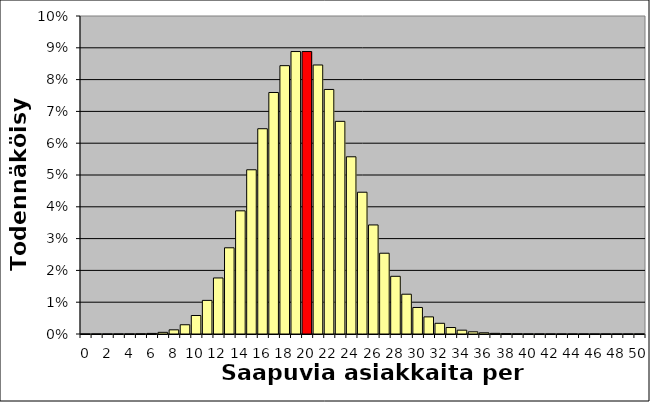
| Category | Series 1 |
|---|---|
| 0.0 | 0 |
| 1.0 | 0 |
| 2.0 | 0 |
| 3.0 | 0 |
| 4.0 | 0 |
| 5.0 | 0 |
| 6.0 | 0 |
| 7.0 | 0.001 |
| 8.0 | 0.001 |
| 9.0 | 0.003 |
| 10.0 | 0.006 |
| 11.0 | 0.011 |
| 12.0 | 0.018 |
| 13.0 | 0.027 |
| 14.0 | 0.039 |
| 15.0 | 0.052 |
| 16.0 | 0.065 |
| 17.0 | 0.076 |
| 18.0 | 0.084 |
| 19.0 | 0.089 |
| 20.0 | 0.089 |
| 21.0 | 0.085 |
| 22.0 | 0.077 |
| 23.0 | 0.067 |
| 24.0 | 0.056 |
| 25.0 | 0.045 |
| 26.0 | 0.034 |
| 27.0 | 0.025 |
| 28.0 | 0.018 |
| 29.0 | 0.013 |
| 30.0 | 0.008 |
| 31.0 | 0.005 |
| 32.0 | 0.003 |
| 33.0 | 0.002 |
| 34.0 | 0.001 |
| 35.0 | 0.001 |
| 36.0 | 0 |
| 37.0 | 0 |
| 38.0 | 0 |
| 39.0 | 0 |
| 40.0 | 0 |
| 41.0 | 0 |
| 42.0 | 0 |
| 43.0 | 0 |
| 44.0 | 0 |
| 45.0 | 0 |
| 46.0 | 0 |
| 47.0 | 0 |
| 48.0 | 0 |
| 49.0 | 0 |
| 50.0 | 0 |